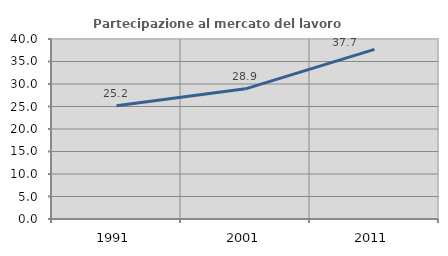
| Category | Partecipazione al mercato del lavoro  femminile |
|---|---|
| 1991.0 | 25.178 |
| 2001.0 | 28.922 |
| 2011.0 | 37.692 |